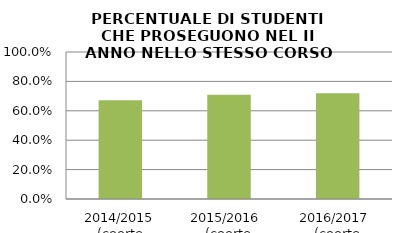
| Category | 2014/2015 (coorte 2013/14) 2015/2016  (coorte 2014/15) 2016/2017  (coorte 2015/16) |
|---|---|
| 2014/2015 (coorte 2013/14) | 0.672 |
| 2015/2016  (coorte 2014/15) | 0.709 |
| 2016/2017  (coorte 2015/16) | 0.719 |